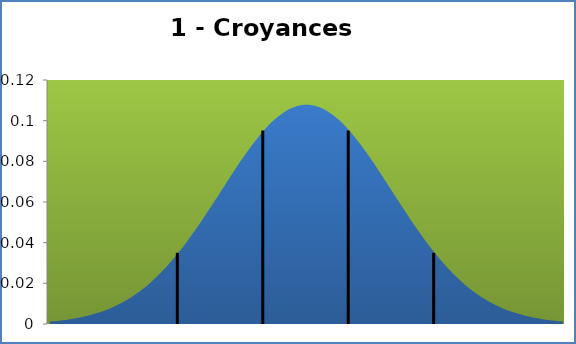
| Category | densité |
|---|---|
| -0.28999999999999915 | 0.001 |
| -0.10500000000000043 | 0.001 |
| 0.08000000000000007 | 0.002 |
| 0.26500000000000057 | 0.002 |
| 0.4499999999999993 | 0.002 |
| 0.6349999999999998 | 0.002 |
| 0.8200000000000003 | 0.003 |
| 1.004999999999999 | 0.003 |
| 1.1899999999999995 | 0.004 |
| 1.375 | 0.004 |
| 1.5600000000000005 | 0.005 |
| 1.7449999999999992 | 0.005 |
| 1.9299999999999997 | 0.006 |
| 2.115 | 0.007 |
| 2.299999999999999 | 0.008 |
| 2.485000000000001 | 0.009 |
| 2.67 | 0.01 |
| 2.8550000000000004 | 0.011 |
| 3.04 | 0.012 |
| 3.2249999999999996 | 0.013 |
| 3.41 | 0.015 |
| 3.5949999999999998 | 0.016 |
| 3.780000000000001 | 0.018 |
| 3.965 | 0.019 |
| 4.1499999999999995 | 0.021 |
| 4.335000000000001 | 0.023 |
| 4.52 | 0.025 |
| 4.705 | 0.028 |
| 4.890000000000001 | 0.03 |
| 5.075 | 0.032 |
| 5.260000000000001 | 0.035 |
| 5.445 | 0.038 |
| 5.63 | 0.04 |
| 5.815 | 0.043 |
| 6.0 | 0.046 |
| 6.1850000000000005 | 0.049 |
| 6.37 | 0.052 |
| 6.555 | 0.056 |
| 6.74 | 0.059 |
| 6.925000000000001 | 0.062 |
| 7.11 | 0.065 |
| 7.295000000000001 | 0.069 |
| 7.48 | 0.072 |
| 7.665 | 0.075 |
| 7.8500000000000005 | 0.078 |
| 8.035 | 0.081 |
| 8.22 | 0.084 |
| 8.405000000000001 | 0.087 |
| 8.59 | 0.09 |
| 8.775 | 0.093 |
| 8.96 | 0.095 |
| 9.145 | 0.097 |
| 9.33 | 0.1 |
| 9.515 | 0.101 |
| 9.700000000000001 | 0.103 |
| 9.885 | 0.105 |
| 10.07 | 0.106 |
| 10.255 | 0.107 |
| 10.440000000000001 | 0.107 |
| 10.625 | 0.108 |
| 10.81 | 0.108 |
| 10.995000000000001 | 0.108 |
| 11.18 | 0.107 |
| 11.365 | 0.107 |
| 11.55 | 0.106 |
| 11.735000000000001 | 0.105 |
| 11.92 | 0.103 |
| 12.105 | 0.101 |
| 12.290000000000001 | 0.1 |
| 12.475000000000001 | 0.097 |
| 12.66 | 0.095 |
| 12.845 | 0.093 |
| 13.030000000000001 | 0.09 |
| 13.215 | 0.087 |
| 13.4 | 0.084 |
| 13.585 | 0.081 |
| 13.77 | 0.078 |
| 13.955000000000002 | 0.075 |
| 14.14 | 0.072 |
| 14.325 | 0.069 |
| 14.510000000000002 | 0.065 |
| 14.695 | 0.062 |
| 14.88 | 0.059 |
| 15.065000000000001 | 0.056 |
| 15.25 | 0.052 |
| 15.435 | 0.049 |
| 15.620000000000001 | 0.046 |
| 15.805 | 0.043 |
| 15.990000000000002 | 0.04 |
| 16.175 | 0.038 |
| 16.36 | 0.035 |
| 16.545 | 0.032 |
| 16.73 | 0.03 |
| 16.915 | 0.028 |
| 17.1 | 0.025 |
| 17.285 | 0.023 |
| 17.470000000000002 | 0.021 |
| 17.655 | 0.019 |
| 17.84 | 0.018 |
| 18.025000000000002 | 0.016 |
| 18.21 | 0.015 |
| 18.395000000000003 | 0.013 |
| 18.580000000000002 | 0.012 |
| 18.765 | 0.011 |
| 18.950000000000003 | 0.01 |
| 19.134999999999998 | 0.009 |
| 19.32 | 0.008 |
| 19.505000000000003 | 0.007 |
| 19.69 | 0.006 |
| 19.875 | 0.005 |
| 20.060000000000002 | 0.005 |
| 20.245 | 0.004 |
| 20.43 | 0.004 |
| 20.615000000000002 | 0.003 |
| 20.8 | 0.003 |
| 20.985 | 0.002 |
| 21.17 | 0.002 |
| 21.355 | 0.002 |
| 21.54 | 0.002 |
| 21.725 | 0.001 |
| 21.91 | 0.001 |